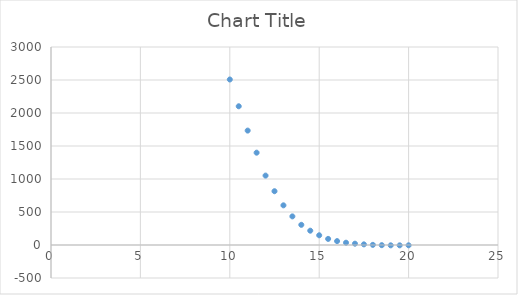
| Category | Series 0 |
|---|---|
| 20.0 | -4.52 |
| 19.5 | -5.07 |
| 19.0 | -5 |
| 18.5 | -2.58 |
| 18.0 | 2.09 |
| 17.5 | 9.79 |
| 17.0 | 19.95 |
| 16.5 | 34.8 |
| 16.0 | 58.87 |
| 15.5 | 92.48 |
| 15.0 | 147.45 |
| 14.5 | 216.82 |
| 14.0 | 305.72 |
| 13.5 | 433.64 |
| 13.0 | 601.05 |
| 12.5 | 814.77 |
| 12.0 | 1051.57 |
| 11.5 | 1398.83 |
| 11.0 | 1733.5 |
| 10.5 | 2102.01 |
| 10.0 | 2507.69 |